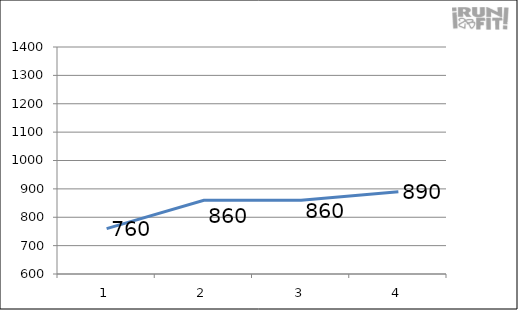
| Category | Series 0 |
|---|---|
| 0 | 760 |
| 1 | 860 |
| 2 | 860 |
| 3 | 890 |